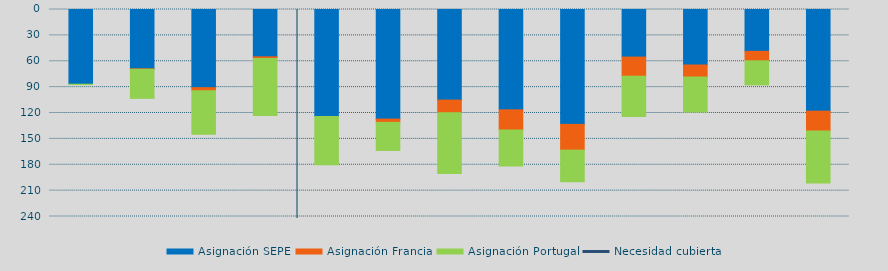
| Category | Asignación SEPE | Asignación Francia | Asignación Portugal |
|---|---|---|---|
| S | 86576 | 0 | 437 |
| O | 68790.4 | 478.1 | 33750 |
| N | 90630.9 | 3513 | 50471 |
| D | 54862.4 | 1882.3 | 66113.3 |
| E | 124168 | 0 | 55888.5 |
| F | 127032.4 | 3833.9 | 32519.8 |
| M | 105026.4 | 14708.8 | 70500 |
| A | 116314.8 | 23425.3 | 41770 |
| M | 133153.9 | 29868.1 | 36645.5 |
| J | 55173.7 | 22114.9 | 46831.4 |
| J | 64347.4 | 13794.4 | 40614.3 |
| A | 48510.6 | 10931.6 | 27867.9 |
| S | 117881.4 | 22871.5 | 60380.5 |